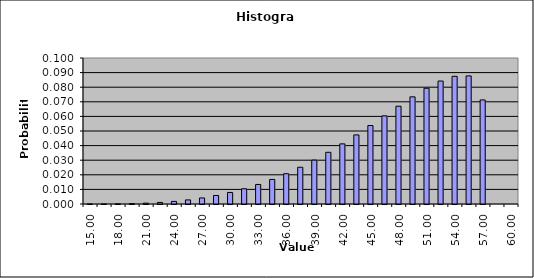
| Category | DISTRIBUTION SCHEDULE |
|---|---|
| 15.0 | 0 |
| 16.5 | 0 |
| 18.0 | 0 |
| 19.5 | 0 |
| 21.0 | 0.001 |
| 22.5 | 0.001 |
| 24.0 | 0.002 |
| 25.5 | 0.003 |
| 27.0 | 0.004 |
| 28.5 | 0.006 |
| 30.0 | 0.008 |
| 31.5 | 0.01 |
| 33.0 | 0.013 |
| 34.5 | 0.017 |
| 36.0 | 0.021 |
| 37.5 | 0.025 |
| 39.0 | 0.03 |
| 40.5 | 0.035 |
| 42.0 | 0.041 |
| 43.5 | 0.047 |
| 45.0 | 0.054 |
| 46.5 | 0.06 |
| 48.0 | 0.067 |
| 49.5 | 0.073 |
| 51.0 | 0.079 |
| 52.5 | 0.084 |
| 54.0 | 0.087 |
| 55.5 | 0.088 |
| 57.0 | 0.071 |
| 58.285714285714285 | 0 |
| 60.0 | 0 |